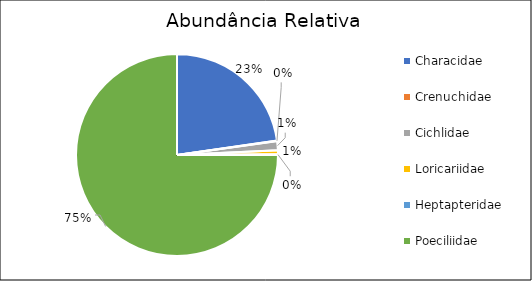
| Category | Series 0 |
|---|---|
| Characidae | 0.227 |
| Crenuchidae  | 0.001 |
| Cichlidae | 0.015 |
| Loricariidae | 0.006 |
| Heptapteridae | 0.001 |
| Poeciliidae | 0.75 |